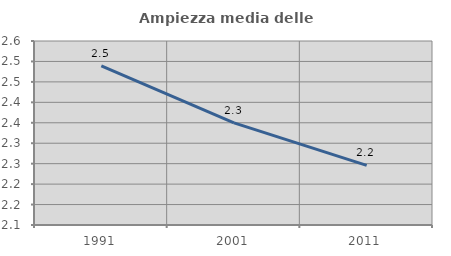
| Category | Ampiezza media delle famiglie |
|---|---|
| 1991.0 | 2.489 |
| 2001.0 | 2.35 |
| 2011.0 | 2.246 |